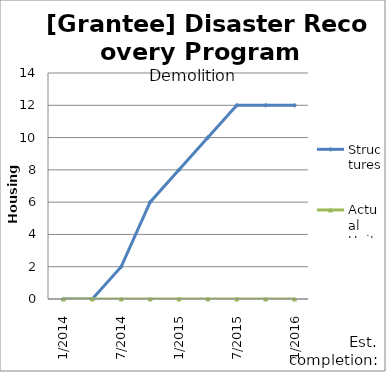
| Category | Structures  | Actual Units |
|---|---|---|
| 1/2014 | 0 | 0 |
| 4/2014 | 0 | 0 |
| 7/2014 | 2 | 0 |
| 10/2014 | 6 | 0 |
| 1/2015 | 8 | 0 |
| 4/2015 | 10 | 0 |
| 7/2015 | 12 | 0 |
| 10/2015 | 12 | 0 |
| 1/2016 | 12 | 0 |